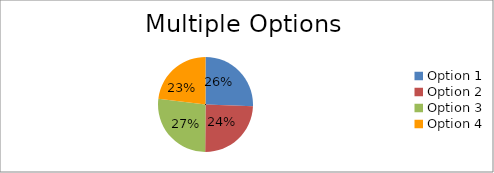
| Category | Options |
|---|---|
| Option 1 | 121 |
| Option 2 | 116 |
| Option 3 | 127 |
| Option 4 | 109 |